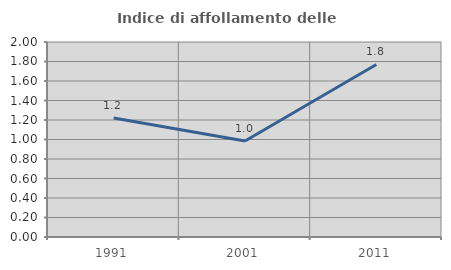
| Category | Indice di affollamento delle abitazioni  |
|---|---|
| 1991.0 | 1.22 |
| 2001.0 | 0.985 |
| 2011.0 | 1.77 |